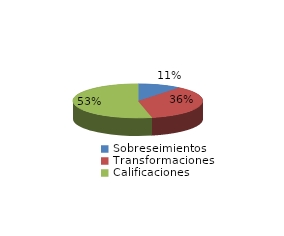
| Category | Series 0 |
|---|---|
| Sobreseimientos | 308 |
| Transformaciones | 1025 |
| Calificaciones | 1529 |